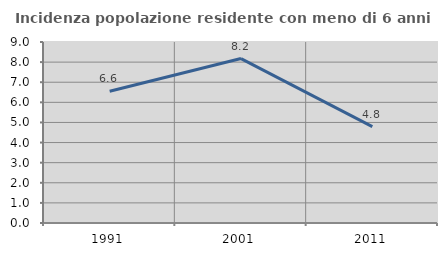
| Category | Incidenza popolazione residente con meno di 6 anni |
|---|---|
| 1991.0 | 6.553 |
| 2001.0 | 8.176 |
| 2011.0 | 4.795 |